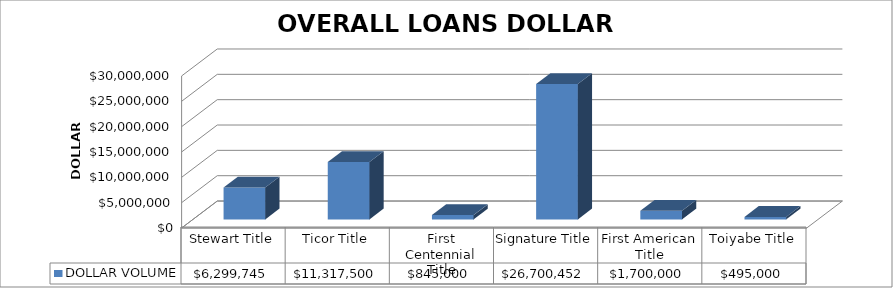
| Category | DOLLAR VOLUME |
|---|---|
| Stewart Title | 6299745 |
| Ticor Title | 11317500 |
| First Centennial Title | 845000 |
| Signature Title | 26700452 |
| First American Title | 1700000 |
| Toiyabe Title | 495000 |